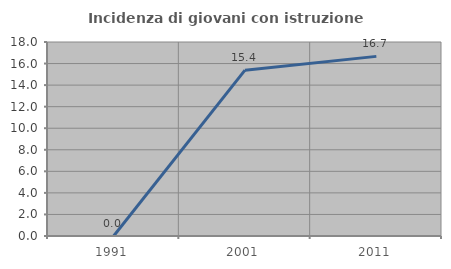
| Category | Incidenza di giovani con istruzione universitaria |
|---|---|
| 1991.0 | 0 |
| 2001.0 | 15.385 |
| 2011.0 | 16.667 |